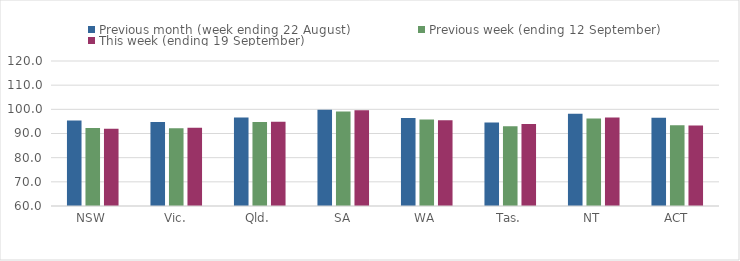
| Category | Previous month (week ending 22 August) | Previous week (ending 12 September) | This week (ending 19 September) |
|---|---|---|---|
| NSW | 95.39 | 92.25 | 91.94 |
| Vic. | 94.8 | 92.22 | 92.39 |
| Qld. | 96.63 | 94.79 | 94.89 |
| SA | 99.84 | 99.14 | 99.67 |
| WA | 96.42 | 95.8 | 95.44 |
| Tas. | 94.55 | 93.05 | 93.94 |
| NT | 98.21 | 96.24 | 96.62 |
| ACT | 96.47 | 93.43 | 93.34 |